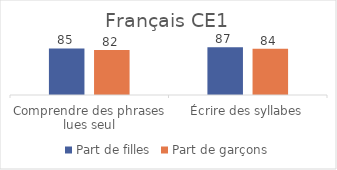
| Category | Part de filles | Part de garçons |
|---|---|---|
| Comprendre des phrases lues seul | 84.61 | 81.63 |
| Écrire des syllabes | 86.67 | 84.02 |